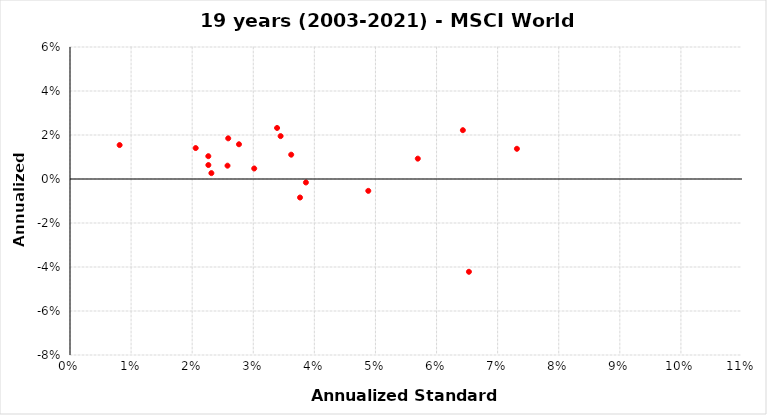
| Category | Series 0 |
|---|---|
| 0.033895130217024214 | 0.023 |
| 0.022640514098935294 | 0.01 |
| 0.022648894262857915 | 0.006 |
| 0.02057702748930618 | 0.014 |
| 0.025782912148737333 | 0.006 |
| 0.06530122241842598 | -0.042 |
| 0.06430966379144269 | 0.022 |
| 0.056932285256900875 | 0.009 |
| 0.04882729808283946 | -0.005 |
| 0.03620903764760691 | 0.011 |
| 0.02589850562041849 | 0.018 |
| 0.023143496143273067 | 0.003 |
| 0.038616160782857956 | -0.002 |
| 0.030156383022709007 | 0.005 |
| 0.00812405708383503 | 0.015 |
| 0.03765413607991398 | -0.008 |
| 0.034473333000529 | 0.019 |
| 0.07315573488683104 | 0.014 |
| 0.027659978898777787 | 0.016 |